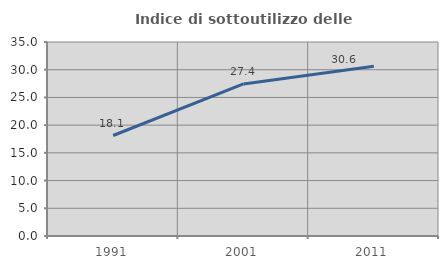
| Category | Indice di sottoutilizzo delle abitazioni  |
|---|---|
| 1991.0 | 18.131 |
| 2001.0 | 27.439 |
| 2011.0 | 30.62 |